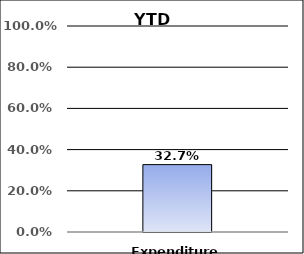
| Category | Series 0 |
|---|---|
| Expenditures | 0.327 |